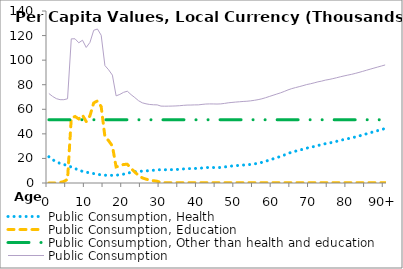
| Category | Public Consumption, Health | Public Consumption, Education | Public Consumption, Other than health and education | Public Consumption |
|---|---|---|---|---|
| 0 | 21366.293 | 0 | 51467.833 | 72834.125 |
|  | 19006.039 | 0 | 51467.833 | 70473.872 |
| 2 | 17199.093 | 0 | 51467.833 | 68666.926 |
| 3 | 15936.454 | 414.086 | 51467.833 | 67818.373 |
| 4 | 15100.649 | 1238.128 | 51467.833 | 67806.609 |
| 5 | 14126.189 | 2963.942 | 51467.833 | 68557.964 |
| 6 | 13030.852 | 52841.807 | 51467.833 | 117340.493 |
| 7 | 11784.735 | 54125.96 | 51467.833 | 117378.527 |
| 8 | 10494.638 | 52168.653 | 51467.833 | 114131.124 |
| 9 | 9485.493 | 55252.233 | 51467.833 | 116205.559 |
| 10 | 8810.74 | 50059.866 | 51467.833 | 110338.439 |
| 11 | 8207.849 | 54763.329 | 51467.833 | 114439.011 |
| 12 | 7649.654 | 65184.795 | 51467.833 | 124302.281 |
| 13 | 7083.788 | 66794.328 | 51467.833 | 125345.949 |
| 14 | 6612.145 | 62189.54 | 51467.833 | 120269.518 |
| 15 | 6347.695 | 37798.037 | 51467.833 | 95613.566 |
| 16 | 6238.451 | 34403.961 | 51467.833 | 92110.244 |
| 17 | 6232.85 | 30107.215 | 51467.833 | 87807.897 |
| 18 | 6369.726 | 13100.769 | 51467.833 | 70938.328 |
| 19 | 6688.032 | 13947.154 | 51467.833 | 72103.019 |
| 20 | 7221.659 | 15100.784 | 51467.833 | 73790.275 |
| 21 | 7994.837 | 15246.95 | 51467.833 | 74709.619 |
| 22 | 8656.764 | 11802.219 | 51467.833 | 71926.816 |
| 23 | 9137.356 | 8934.273 | 51467.833 | 69539.461 |
| 24 | 9434.568 | 6095.017 | 51467.833 | 66997.417 |
| 25 | 9650.155 | 4152.1 | 51467.833 | 65270.087 |
| 26 | 9841.447 | 3148.379 | 51467.833 | 64457.659 |
| 27 | 10095.022 | 2346.637 | 51467.833 | 63909.492 |
| 28 | 10357.709 | 1848.799 | 51467.833 | 63674.342 |
| 29 | 10691.888 | 1423.2 | 51467.833 | 63582.921 |
| 30 | 10837.322 | 284.259 | 51467.833 | 62589.414 |
| 31 | 10769.71 | 284.259 | 51467.833 | 62521.802 |
| 32 | 10801.265 | 284.259 | 51467.833 | 62553.357 |
| 33 | 10869.617 | 284.259 | 51467.833 | 62621.709 |
| 34 | 10978.969 | 284.259 | 51467.833 | 62731.061 |
| 35 | 11169.899 | 284.259 | 51467.833 | 62921.991 |
| 36 | 11447.262 | 284.259 | 51467.833 | 63199.354 |
| 37 | 11661.994 | 284.259 | 51467.833 | 63414.086 |
| 38 | 11710.359 | 284.259 | 51467.833 | 63462.451 |
| 39 | 11813.177 | 284.259 | 51467.833 | 63565.269 |
| 40 | 11850.394 | 284.259 | 51467.833 | 63602.486 |
| 41 | 12209.747 | 284.259 | 51467.833 | 63961.839 |
| 42 | 12523.601 | 284.259 | 51467.833 | 64275.693 |
| 43 | 12616.249 | 284.259 | 51467.833 | 64368.341 |
| 44 | 12595.153 | 284.259 | 51467.833 | 64347.245 |
| 45 | 12521.368 | 284.259 | 51467.833 | 64273.46 |
| 46 | 12630.06 | 284.259 | 51467.833 | 64382.152 |
| 47 | 13021.514 | 284.259 | 51467.833 | 64773.606 |
| 48 | 13508.836 | 284.259 | 51467.833 | 65260.928 |
| 49 | 13826.612 | 284.259 | 51467.833 | 65578.704 |
| 50 | 14116.505 | 284.259 | 51467.833 | 65868.597 |
| 51 | 14365.741 | 284.259 | 51467.833 | 66117.833 |
| 52 | 14616.119 | 284.259 | 51467.833 | 66368.21 |
| 53 | 14795.299 | 284.259 | 51467.833 | 66547.391 |
| 54 | 15107.85 | 284.259 | 51467.833 | 66859.942 |
| 55 | 15563.548 | 284.259 | 51467.833 | 67315.64 |
| 56 | 16090.784 | 284.259 | 51467.833 | 67842.876 |
| 57 | 16766.273 | 284.259 | 51467.833 | 68518.365 |
| 58 | 17666.482 | 284.259 | 51467.833 | 69418.574 |
| 59 | 18665.453 | 284.259 | 51467.833 | 70417.545 |
| 60 | 19654.835 | 284.259 | 51467.833 | 71406.927 |
| 61 | 20647.335 | 284.259 | 51467.833 | 72399.427 |
| 62 | 21630.175 | 284.259 | 51467.833 | 73382.267 |
| 63 | 22774.791 | 284.259 | 51467.833 | 74526.883 |
| 64 | 24013.066 | 284.259 | 51467.833 | 75765.158 |
| 65 | 25059.557 | 284.259 | 51467.833 | 76811.649 |
| 66 | 25891.024 | 284.259 | 51467.833 | 77643.116 |
| 67 | 26662.153 | 284.259 | 51467.833 | 78414.245 |
| 68 | 27474.399 | 284.259 | 51467.833 | 79226.491 |
| 69 | 28368.96 | 284.259 | 51467.833 | 80121.052 |
| 70 | 29003.15 | 284.259 | 51467.833 | 80755.241 |
| 71 | 29751.958 | 284.259 | 51467.833 | 81504.049 |
| 72 | 30583.817 | 284.259 | 51467.833 | 82335.909 |
| 73 | 31163.6 | 284.259 | 51467.833 | 82915.692 |
| 74 | 31995.234 | 284.259 | 51467.833 | 83747.326 |
| 75 | 32510.704 | 284.259 | 51467.833 | 84262.796 |
| 76 | 33191.535 | 284.259 | 51467.833 | 84943.627 |
| 77 | 33915.688 | 284.259 | 51467.833 | 85667.78 |
| 78 | 34682.028 | 284.259 | 51467.833 | 86434.12 |
| 79 | 35395.415 | 284.259 | 51467.833 | 87147.507 |
| 80 | 36053.531 | 284.259 | 51467.833 | 87805.623 |
| 81 | 36686.141 | 284.259 | 51467.833 | 88438.233 |
| 82 | 37440.671 | 284.259 | 51467.833 | 89192.763 |
| 83 | 38258.191 | 284.259 | 51467.833 | 90010.283 |
| 84 | 39124.798 | 284.259 | 51467.833 | 90876.89 |
| 85 | 40010.449 | 284.259 | 51467.833 | 91762.541 |
| 86 | 40895.691 | 284.259 | 51467.833 | 92647.783 |
| 87 | 41767.739 | 284.259 | 51467.833 | 93519.83 |
| 88 | 42624.22 | 284.259 | 51467.833 | 94376.312 |
| 89 | 43471.737 | 284.259 | 51467.833 | 95223.828 |
| 90+ | 44337.833 | 284.259 | 51467.833 | 96089.925 |